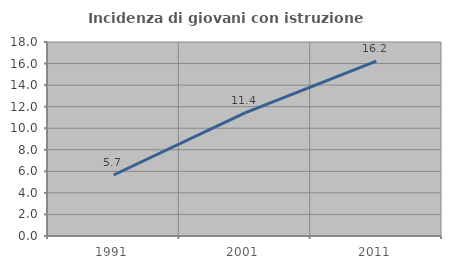
| Category | Incidenza di giovani con istruzione universitaria |
|---|---|
| 1991.0 | 5.66 |
| 2001.0 | 11.416 |
| 2011.0 | 16.216 |